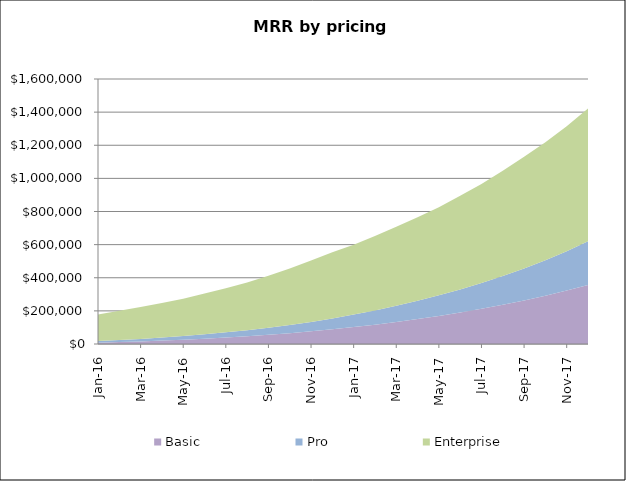
| Category | Basic | Pro | Enterprise |
|---|---|---|---|
| 2016-01-01 | 8050 | 9500 | 161000 |
| 2016-02-01 | 11607.75 | 1206 | 177000 |
| 2016-03-01 | 15756.39 | 14897.869 | 193000 |
| 2016-04-01 | 20555.271 | 18271.352 | 209000 |
| 2016-05-01 | 26013.838 | 22188.273 | 225000 |
| 2016-06-01 | 32192.889 | 26656.533 | 246000 |
| 2016-07-01 | 39154.345 | 31168.92 | 267000 |
| 2016-08-01 | 46961.258 | 36761.294 | 288000 |
| 2016-09-01 | 55729.862 | 42929.166 | 314000 |
| 2016-10-01 | 65526.298 | 49680.753 | 340000 |
| 2016-11-01 | 76470.445 | 57024.352 | 370000 |
| 2016-12-01 | 88578.791 | 65760.641 | 400000 |
| 2017-01-01 | 102080.322 | 75379.125 | 422000 |
| 2017-02-01 | 116781.64 | 86159.136 | 449500 |
| 2017-03-01 | 132806.972 | 97849.303 | 477000 |
| 2017-04-01 | 150228.974 | 110731.901 | 504500 |
| 2017-05-01 | 169175.714 | 124553.182 | 532000 |
| 2017-06-01 | 189723.198 | 139870.516 | 565000 |
| 2017-07-01 | 212112.821 | 156158.356 | 598000 |
| 2017-08-01 | 236425.666 | 173979.826 | 636000 |
| 2017-09-01 | 262744.168 | 193632.95 | 674000 |
| 2017-10-01 | 291263.18 | 215143.886 | 712000 |
| 2017-11-01 | 322292.758 | 238260.055 | 754500 |
| 2017-12-01 | 355924.532 | 263845.112 | 802000 |